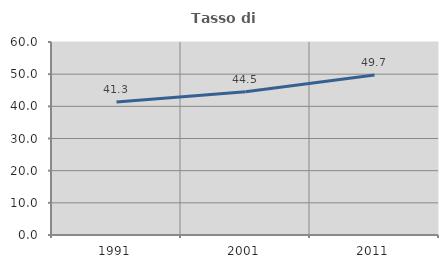
| Category | Tasso di occupazione   |
|---|---|
| 1991.0 | 41.322 |
| 2001.0 | 44.545 |
| 2011.0 | 49.733 |